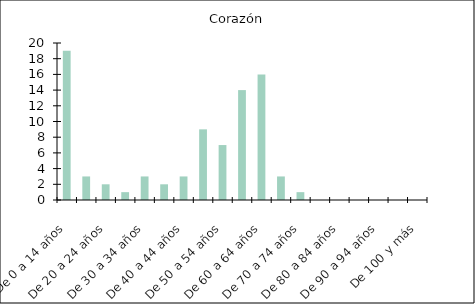
| Category | Corazón |
|---|---|
| De 0 a 14 años | 19 |
| De 15 a 19 años | 3 |
| De 20 a 24 años | 2 |
| De 25 a 29 años | 1 |
| De 30 a 34 años | 3 |
| De 35 a 39 años | 2 |
| De 40 a 44 años | 3 |
| De 45 a 49 años | 9 |
| De 50 a 54 años | 7 |
| De 55 a 59 años | 14 |
| De 60 a 64 años | 16 |
| De 65 a 69 años | 3 |
| De 70 a 74 años | 1 |
| De 75 a 79 años | 0 |
| De 80 a 84 años | 0 |
| De 85 a 89 años | 0 |
| De 90 a 94 años | 0 |
| De 95 a 99 años | 0 |
| De 100 y más | 0 |